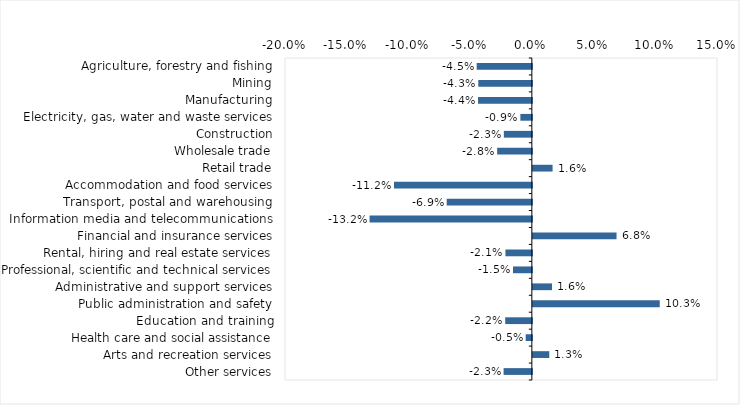
| Category | This week |
|---|---|
| Agriculture, forestry and fishing | -0.045 |
| Mining | -0.043 |
| Manufacturing | -0.044 |
| Electricity, gas, water and waste services | -0.009 |
| Construction | -0.023 |
| Wholesale trade | -0.028 |
| Retail trade | 0.016 |
| Accommodation and food services | -0.112 |
| Transport, postal and warehousing | -0.069 |
| Information media and telecommunications | -0.132 |
| Financial and insurance services | 0.068 |
| Rental, hiring and real estate services | -0.021 |
| Professional, scientific and technical services | -0.015 |
| Administrative and support services | 0.016 |
| Public administration and safety | 0.103 |
| Education and training | -0.022 |
| Health care and social assistance | -0.005 |
| Arts and recreation services | 0.013 |
| Other services | -0.023 |